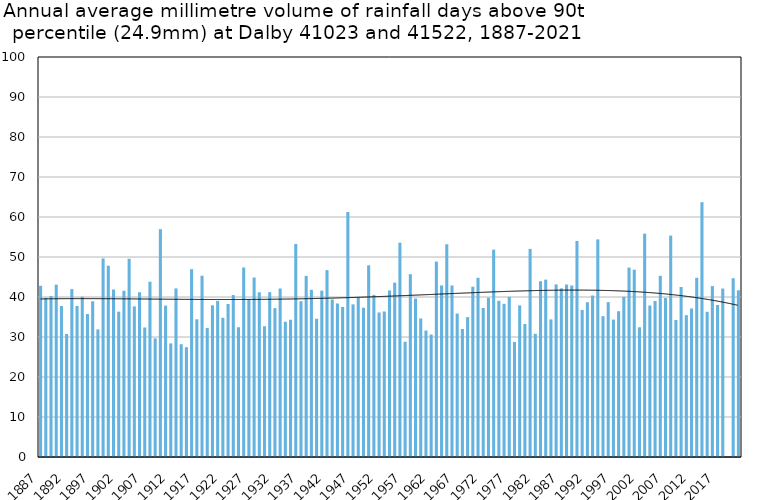
| Category | Annual average mm in days above 90th percentile |
|---|---|
| 1887 | 42.8 |
| 1888 | 39.8 |
| 1889 | 40.25 |
| 1890 | 43.088 |
| 1891 | 37.746 |
| 1892 | 30.75 |
| 1893 | 41.988 |
| 1894 | 37.757 |
| 1895 | 40.067 |
| 1896 | 35.771 |
| 1897 | 38.929 |
| 1898 | 31.9 |
| 1899 | 49.64 |
| 1900 | 47.829 |
| 1901 | 41.9 |
| 1902 | 36.333 |
| 1903 | 41.564 |
| 1904 | 49.55 |
| 1905 | 37.655 |
| 1906 | 41.189 |
| 1907 | 32.38 |
| 1908 | 43.829 |
| 1909 | 29.667 |
| 1910 | 56.962 |
| 1911 | 37.843 |
| 1912 | 28.4 |
| 1913 | 42.15 |
| 1914 | 28.2 |
| 1915 | 27.45 |
| 1916 | 46.96 |
| 1917 | 34.425 |
| 1918 | 45.325 |
| 1919 | 32.267 |
| 1920 | 37.912 |
| 1921 | 39.03 |
| 1922 | 34.8 |
| 1923 | 38.26 |
| 1924 | 40.486 |
| 1925 | 32.44 |
| 1926 | 47.375 |
| 1927 | 39.433 |
| 1928 | 44.867 |
| 1929 | 41.183 |
| 1930 | 32.67 |
| 1931 | 41.214 |
| 1932 | 37.217 |
| 1933 | 42.122 |
| 1934 | 33.814 |
| 1935 | 34.312 |
| 1936 | 53.267 |
| 1937 | 38.944 |
| 1938 | 45.283 |
| 1939 | 41.8 |
| 1940 | 34.564 |
| 1941 | 41.6 |
| 1942 | 46.725 |
| 1943 | 39.382 |
| 1944 | 38.383 |
| 1945 | 37.52 |
| 1946 | 61.25 |
| 1947 | 38.155 |
| 1948 | 39.88 |
| 1949 | 37.317 |
| 1950 | 47.922 |
| 1951 | 40.525 |
| 1952 | 36.133 |
| 1953 | 36.38 |
| 1954 | 41.65 |
| 1955 | 43.6 |
| 1956 | 53.571 |
| 1957 | 28.825 |
| 1958 | 45.7 |
| 1959 | 39.617 |
| 1960 | 34.633 |
| 1961 | 31.622 |
| 1962 | 30.629 |
| 1963 | 48.85 |
| 1964 | 42.888 |
| 1965 | 53.186 |
| 1966 | 42.888 |
| 1967 | 35.862 |
| 1968 | 32 |
| 1969 | 34.971 |
| 1970 | 42.578 |
| 1971 | 44.808 |
| 1972 | 37.257 |
| 1973 | 39.814 |
| 1974 | 51.84 |
| 1975 | 39.056 |
| 1976 | 38.3 |
| 1977 | 40.033 |
| 1978 | 28.75 |
| 1979 | 37.9 |
| 1980 | 33.267 |
| 1981 | 52.033 |
| 1982 | 30.8 |
| 1983 | 43.967 |
| 1984 | 44.343 |
| 1985 | 34.4 |
| 1986 | 43.15 |
| 1987 | 42.16 |
| 1988 | 43.113 |
| 1989 | 42.88 |
| 1990 | 54 |
| 1991 | 36.75 |
| 1992 | 38.7 |
| 1993 | 40.367 |
| 1994 | 54.4 |
| 1995 | 35.2 |
| 1996 | 38.717 |
| 1997 | 34.36 |
| 1998 | 36.444 |
| 1999 | 40.044 |
| 2000 | 47.35 |
| 2001 | 46.833 |
| 2002 | 32.436 |
| 2003 | 55.833 |
| 2004 | 37.875 |
| 2005 | 39 |
| 2006 | 45.3 |
| 2007 | 39.76 |
| 2008 | 55.35 |
| 2009 | 34.267 |
| 2010 | 42.5 |
| 2011 | 35.45 |
| 2012 | 37.1 |
| 2013 | 44.8 |
| 2014 | 63.7 |
| 2015 | 36.3 |
| 2016 | 42.733 |
| 2017 | 38 |
| 2018 | 42.111 |
| 2019 | 0 |
| 2020 | 44.7 |
| 2021 | 41.673 |